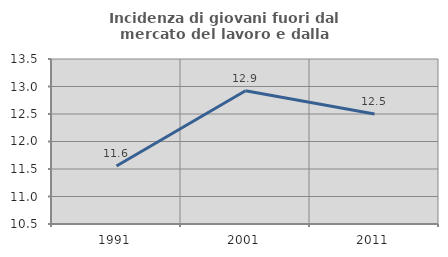
| Category | Incidenza di giovani fuori dal mercato del lavoro e dalla formazione  |
|---|---|
| 1991.0 | 11.556 |
| 2001.0 | 12.921 |
| 2011.0 | 12.5 |